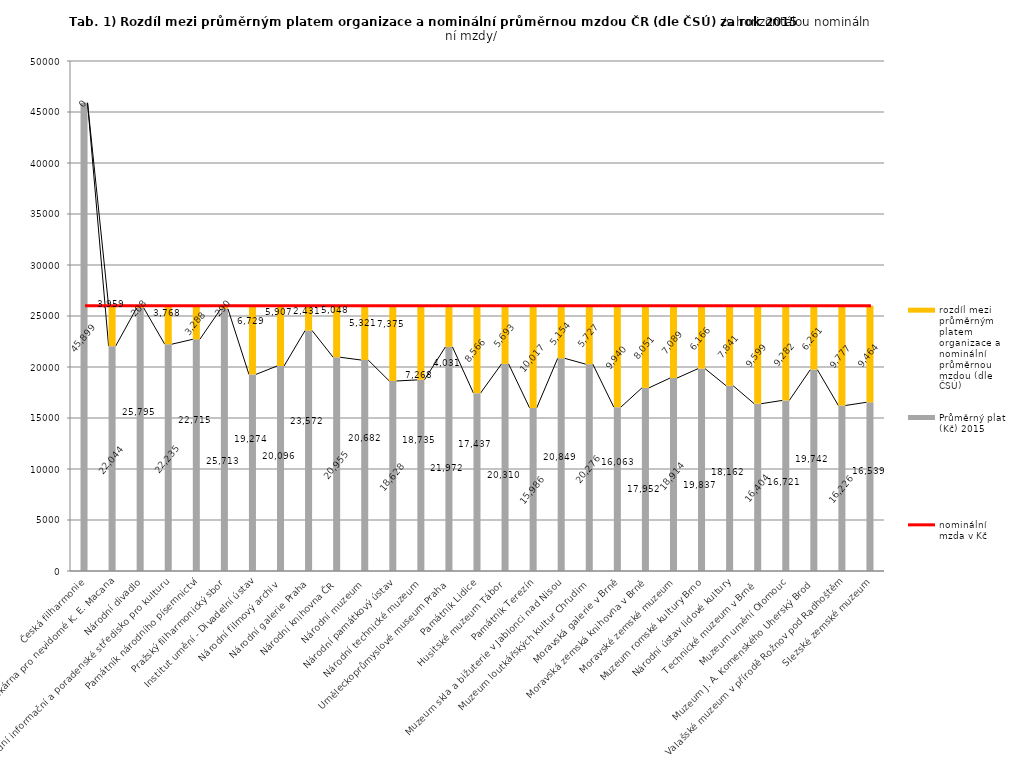
| Category | Průměrný plat (Kč) 2015 | rozdíl mezi průměrným platem organizace a nominální průměrnou mzdou (dle ČSÚ) |
|---|---|---|
| Česká filharmonie | 45899 | 0 |
| Knihovna a tiskárna pro nevidomé K. E. Macana | 22044 | 3958.828 |
| Národní divadlo | 25795 | 207.828 |
| Národní informační a poradenské středisko pro kulturu | 22235 | 3767.828 |
| Památník národního písemnictví | 22715 | 3287.828 |
| Pražský filharmonický sbor | 25713 | 289.828 |
| Institut umění - Divadelní ústav | 19274 | 6728.828 |
| Národní filmový archiv | 20096 | 5906.828 |
| Národní galerie Praha | 23572 | 2430.828 |
| Národní knihovna ČR | 20955 | 5047.828 |
| Národní muzeum | 20682 | 5320.828 |
| Národní památkový ústav | 18628 | 7374.828 |
| Národní technické muzeum | 18735 | 7267.828 |
| Uměleckoprůmyslové museum Praha | 21972 | 4030.828 |
| Památník Lidice | 17437 | 8565.828 |
| Husitské muzeum Tábor | 20310 | 5692.828 |
| Památník Terezín | 15986 | 10016.828 |
| Muzeum skla a bižuterie v Jablonci nad Nisou | 20849 | 5153.828 |
| Muzeum loutkářských kultur Chrudim | 20276 | 5726.828 |
| Moravská galerie v Brně | 16063 | 9939.828 |
| Moravská zemská knihovna v Brně | 17952 | 8050.828 |
| Moravské zemské muzeum | 18914 | 7088.828 |
| Muzeum romské kultury Brno | 19837 | 6165.828 |
| Národní ústav lidové kultury | 18162 | 7840.828 |
| Technické muzeum v Brně  | 16404 | 9598.828 |
| Muzeum umění Olomouc | 16721 | 9281.828 |
| Muzeum J. A. Komenského Uherský Brod | 19742 | 6260.828 |
| Valašské muzeum v přírodě Rožnov pod Radhoštěm | 16226 | 9776.828 |
| Slezské zemské muzeum | 16539 | 9463.828 |